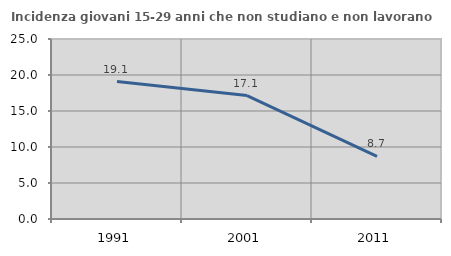
| Category | Incidenza giovani 15-29 anni che non studiano e non lavorano  |
|---|---|
| 1991.0 | 19.097 |
| 2001.0 | 17.143 |
| 2011.0 | 8.696 |